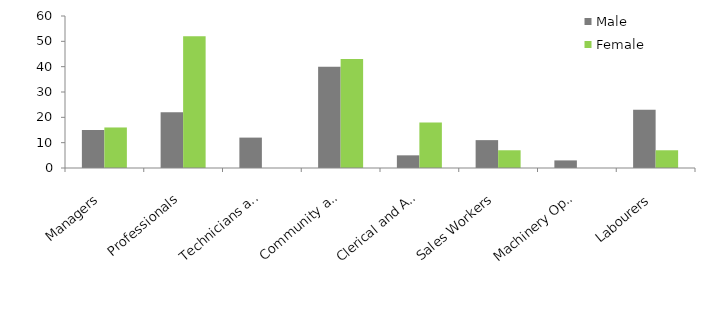
| Category | Male | Female |
|---|---|---|
| Managers | 15 | 16 |
| Professionals | 22 | 52 |
| Technicians and Trades Workers | 12 | 0 |
| Community and Personal Service Workers | 40 | 43 |
| Clerical and Administrative Workers | 5 | 18 |
| Sales Workers | 11 | 7 |
| Machinery Operators and Drivers | 3 | 0 |
| Labourers | 23 | 7 |